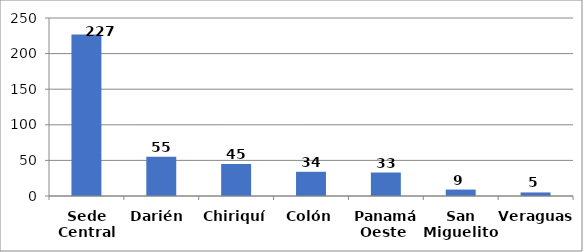
| Category | Series 0 |
|---|---|
| Sede Central | 227 |
| Darién  | 55 |
| Chiriquí | 45 |
| Colón | 34 |
| Panamá Oeste  | 33 |
| San Miguelito  | 9 |
| Veraguas | 5 |